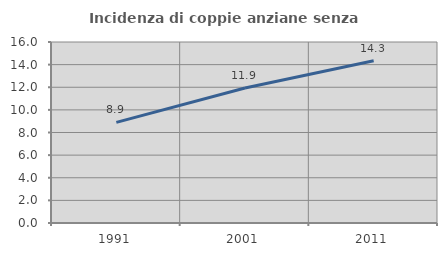
| Category | Incidenza di coppie anziane senza figli  |
|---|---|
| 1991.0 | 8.899 |
| 2001.0 | 11.937 |
| 2011.0 | 14.349 |